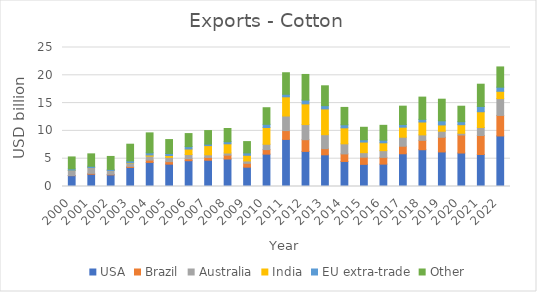
| Category | USA | Brazil | Australia | India | EU extra-trade | Other  |
|---|---|---|---|---|---|---|
| 2000.0 | 1948.509 | 32.522 | 887.522 | 44.582 | 255.059 | 2149.386 |
| 2001.0 | 2206.736 | 155.102 | 1031.153 | 11.88 | 228.209 | 2237.372 |
| 2002.0 | 2093.33 | 94.249 | 680.918 | 9.332 | 194.862 | 2333.477 |
| 2003.0 | 3427.616 | 189.545 | 595.334 | 59.405 | 332.671 | 3003.027 |
| 2004.0 | 4334.141 | 407.005 | 713.238 | 209.566 | 389.732 | 3590.613 |
| 2005.0 | 4019.453 | 453.225 | 770 | 334.799 | 354.751 | 2509.983 |
| 2006.0 | 4641.122 | 342.393 | 764.545 | 992.939 | 430.619 | 2347.152 |
| 2007.0 | 4722.893 | 509.935 | 467.54 | 1657.012 | 261.584 | 2441.722 |
| 2008.0 | 4943.906 | 700.529 | 377.956 | 1656.624 | 371.909 | 2382.902 |
| 2009.0 | 3478.781 | 690.252 | 422.071 | 1023.261 | 430.456 | 2033.033 |
| 2010.0 | 5816.629 | 821.968 | 958.395 | 3019.354 | 567.303 | 2984.252 |
| 2011.0 | 8466.009 | 1588.466 | 2621.106 | 3456.253 | 459.219 | 3868.286 |
| 2012.0 | 6312.487 | 2104.894 | 2718.637 | 3730.925 | 670.093 | 4615.504 |
| 2013.0 | 5699.687 | 1106.803 | 2512.321 | 4635.143 | 589.73 | 3568.29 |
| 2014.0 | 4501.584 | 1359.827 | 1812.264 | 2880.677 | 547.242 | 3121.947 |
| 2015.0 | 3983.258 | 1290.161 | 813.865 | 1905.741 | 411.383 | 2247.627 |
| 2016.0 | 4023.51 | 1216.039 | 1207.619 | 1413.574 | 476.596 | 2664.432 |
| 2017.0 | 5885.904 | 1358.868 | 1619.479 | 1803.933 | 479.483 | 3302.654 |
| 2018.0 | 6614.267 | 1689.254 | 978.882 | 2319.294 | 471.769 | 4004.176 |
| 2019.0 | 6214.214 | 2641.54 | 1087.593 | 1130.735 | 739.507 | 3888.242 |
| 2020.0 | 6020.997 | 3237.331 | 308.68 | 1549.58 | 539.477 | 2784.094 |
| 2021.0 | 5757.726 | 3413.807 | 1439.713 | 2833.954 | 952.651 | 4001.341 |
| 2022.0 | 9091.645 | 3689.817 | 3023.167 | 1319.561 | 742.128 | 3638.574 |